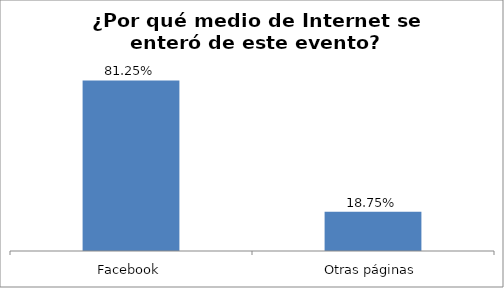
| Category | Total |
|---|---|
| Facebook | 0.812 |
| Otras páginas | 0.188 |